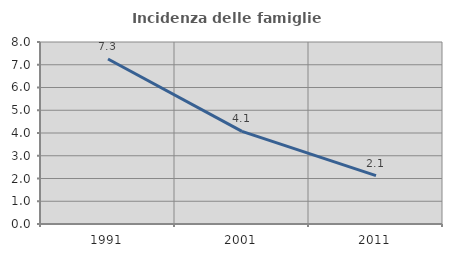
| Category | Incidenza delle famiglie numerose |
|---|---|
| 1991.0 | 7.253 |
| 2001.0 | 4.072 |
| 2011.0 | 2.128 |